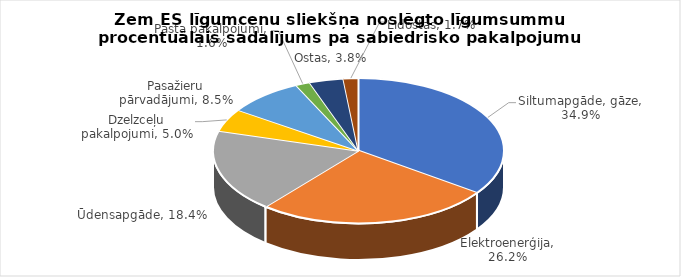
| Category | Series 0 | Series 1 |
|---|---|---|
| Siltumapgāde, gāze | 0.349 | 0.368 |
| Elektroenerģija | 0.262 | 0.372 |
| Ūdensapgāde | 0.184 | 0.219 |
| Dzelzceļu pakalpojumi | 0.05 | 0.002 |
| Pasažieru pārvadājumi | 0.085 | 0.006 |
| Pasta pakalpojumi | 0.016 | 0 |
| Ostas | 0.038 | 0.022 |
| Lidostas | 0.017 | 0.009 |